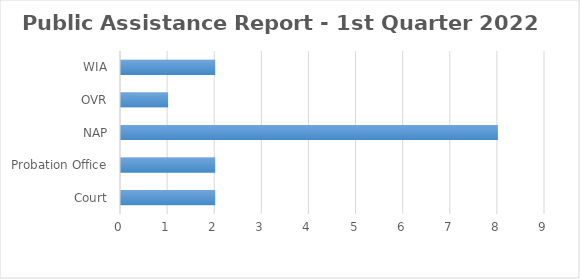
| Category | Series 0 |
|---|---|
| Court | 2 |
| Probation Office | 2 |
| NAP | 8 |
| OVR | 1 |
| WIA | 2 |